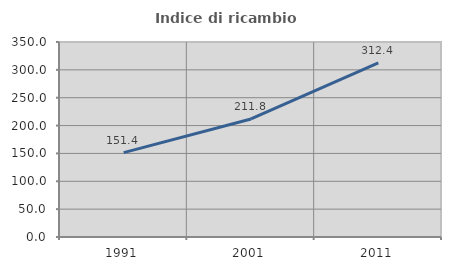
| Category | Indice di ricambio occupazionale  |
|---|---|
| 1991.0 | 151.429 |
| 2001.0 | 211.842 |
| 2011.0 | 312.361 |